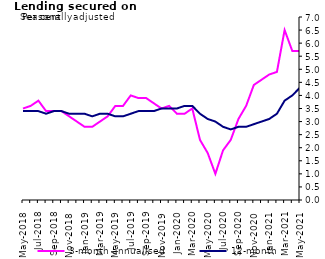
| Category | 3-month annualised | 12-month |
|---|---|---|
| May-2018 | 3.5 | 3.4 |
| Jun-2018 | 3.6 | 3.4 |
| Jul-2018 | 3.8 | 3.4 |
| Aug-2018 | 3.4 | 3.3 |
| Sep-2018 | 3.4 | 3.4 |
| Oct-2018 | 3.4 | 3.4 |
| Nov-2018 | 3.2 | 3.3 |
| Dec-2018 | 3 | 3.3 |
| Jan-2019 | 2.8 | 3.3 |
| Feb-2019 | 2.8 | 3.2 |
| Mar-2019 | 3 | 3.3 |
| Apr-2019 | 3.2 | 3.3 |
| May-2019 | 3.6 | 3.2 |
| Jun-2019 | 3.6 | 3.2 |
| Jul-2019 | 4 | 3.3 |
| Aug-2019 | 3.9 | 3.4 |
| Sep-2019 | 3.9 | 3.4 |
| Oct-2019 | 3.7 | 3.4 |
| Nov-2019 | 3.5 | 3.5 |
| Dec-2019 | 3.6 | 3.5 |
| Jan-2020 | 3.3 | 3.5 |
| Feb-2020 | 3.3 | 3.6 |
| Mar-2020 | 3.5 | 3.6 |
| Apr-2020 | 2.3 | 3.3 |
| May-2020 | 1.8 | 3.1 |
| Jun-2020 | 1 | 3 |
| Jul-2020 | 1.9 | 2.8 |
| Aug-2020 | 2.3 | 2.7 |
| Sep-2020 | 3.1 | 2.8 |
| Oct-2020 | 3.6 | 2.8 |
| Nov-2020 | 4.4 | 2.9 |
| Dec-2020 | 4.6 | 3 |
| Jan-2021 | 4.8 | 3.1 |
| Feb-2021 | 4.9 | 3.3 |
| Mar-2021 | 6.5 | 3.8 |
| Apr-2021 | 5.7 | 4 |
| May-2021 | 5.7 | 4.3 |